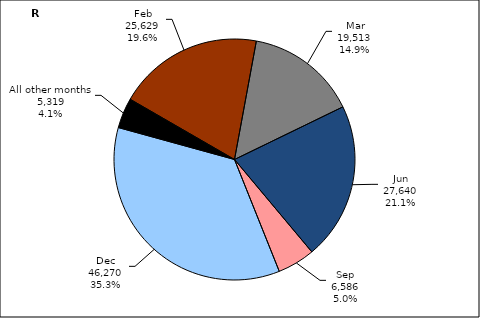
| Category | Series 3 |
|---|---|
| Feb | 25628.966 |
| Mar | 19513.264 |
| Jun | 27639.564 |
| Sep | 6585.867 |
| Dec | 46270.24 |
| All other months | 5319.141 |